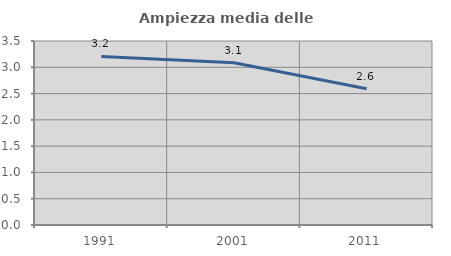
| Category | Ampiezza media delle famiglie |
|---|---|
| 1991.0 | 3.205 |
| 2001.0 | 3.085 |
| 2011.0 | 2.591 |